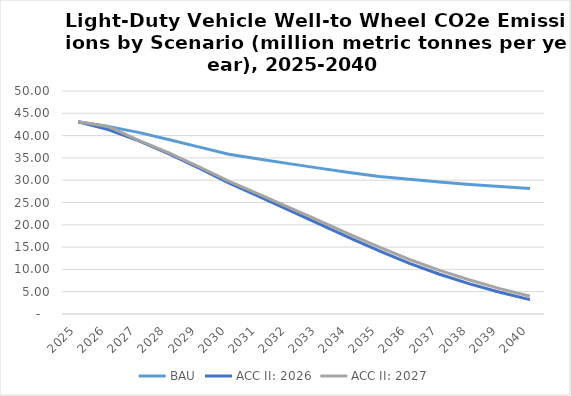
| Category | BAU | ACC II: 2026 | ACC II: 2027 |
|---|---|---|---|
| 2025.0 | 43.109 | 43.109 | 43.109 |
| 2026.0 | 42.047 | 41.339 | 42.047 |
| 2027.0 | 40.718 | 38.894 | 38.998 |
| 2028.0 | 39.141 | 35.963 | 36.167 |
| 2029.0 | 37.465 | 32.751 | 33.06 |
| 2030.0 | 35.825 | 29.401 | 29.817 |
| 2031.0 | 34.766 | 26.367 | 26.894 |
| 2032.0 | 33.717 | 23.266 | 23.896 |
| 2033.0 | 32.71 | 20.224 | 20.939 |
| 2034.0 | 31.749 | 17.129 | 17.918 |
| 2035.0 | 30.853 | 14.128 | 14.972 |
| 2036.0 | 30.198 | 11.344 | 12.223 |
| 2037.0 | 29.602 | 8.91 | 9.794 |
| 2038.0 | 29.06 | 6.757 | 7.625 |
| 2039.0 | 28.568 | 4.866 | 5.688 |
| 2040.0 | 28.131 | 3.219 | 3.969 |